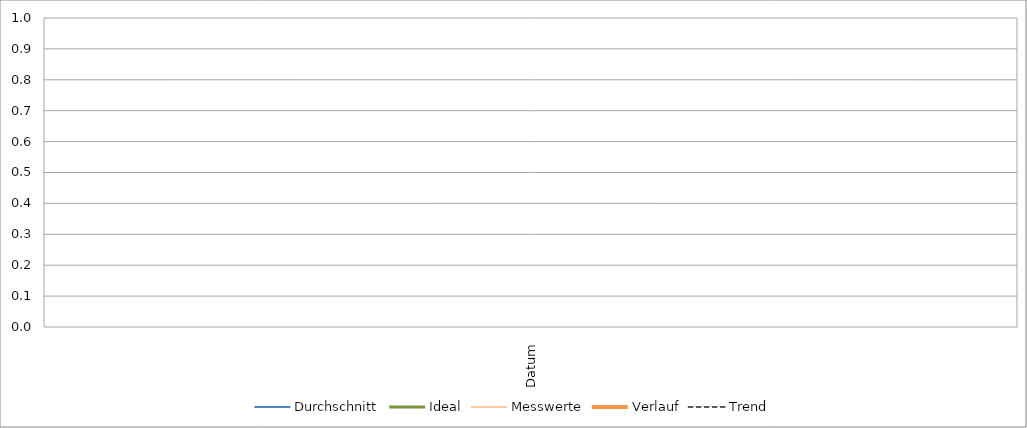
| Category | Durchschnitt | Ideal | Messwerte | Verlauf | Trend |
|---|---|---|---|---|---|
| Datum |  |  | 0 |  |  |